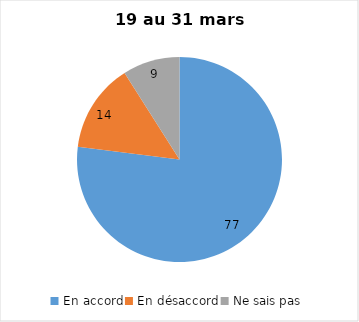
| Category | Series 0 |
|---|---|
| En accord | 77 |
| En désaccord | 14 |
| Ne sais pas | 9 |